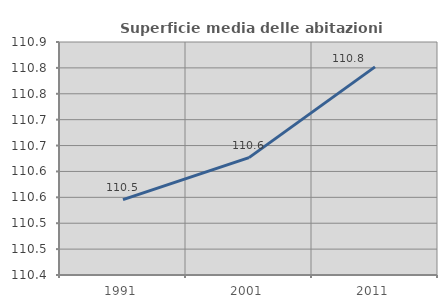
| Category | Superficie media delle abitazioni occupate |
|---|---|
| 1991.0 | 110.545 |
| 2001.0 | 110.627 |
| 2011.0 | 110.802 |